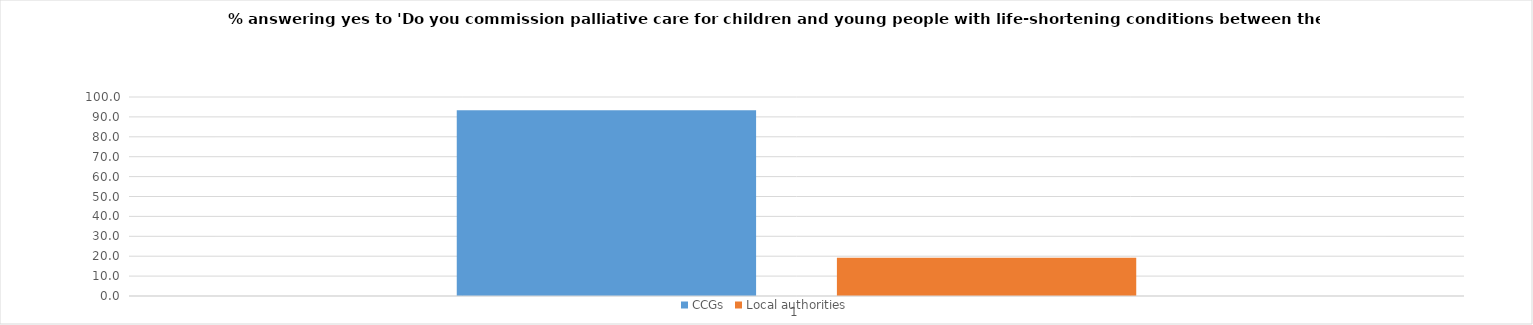
| Category | CCGs | Local authorities |
|---|---|---|
| 0 | 93.382 | 19.231 |